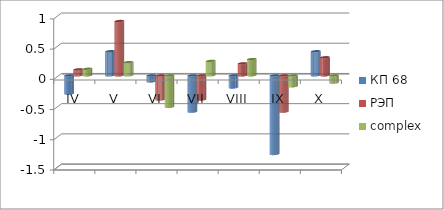
| Category | КП 68 | РЭП  | complex |
|---|---|---|---|
| IV | -0.3 | 0.1 | 0.11 |
| V | 0.4 | 0.9 | 0.22 |
| VI | -0.1 | -0.4 | -0.52 |
| VII | -0.6 | -0.4 | 0.24 |
| VIII | -0.2 | 0.2 | 0.27 |
| IX | -1.3 | -0.6 | -0.18 |
| X | 0.4 | 0.3 | -0.12 |